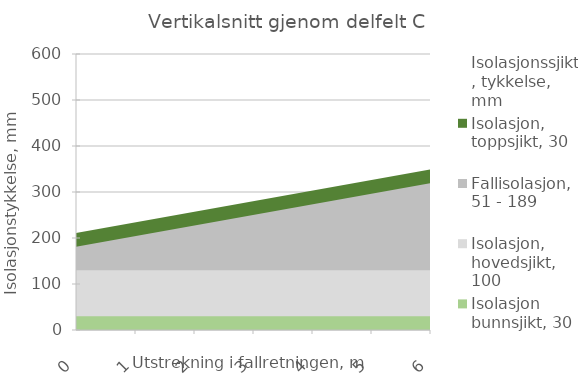
| Category | Isolasjonssjikt, tykkelse, mm | Isolasjon, toppsjikt, 30 | Fallisolasjon, 51 - 189 | Isolasjon, hovedsjikt, 100 | Isolasjon bunnsjikt, 30 |
|---|---|---|---|---|---|
| 0.0 |  | 211 | 181 | 130 | 30 |
| 5.5 |  | 349 | 319 | 130 | 30 |